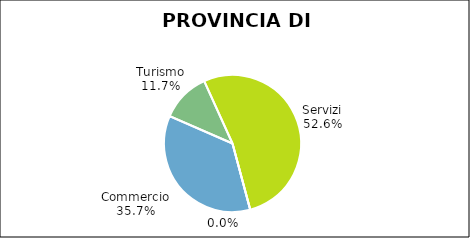
| Category | Provincia di Varese |
|---|---|
| Commercio | 18248 |
| Turismo | 5974 |
| Servizi | 26892 |